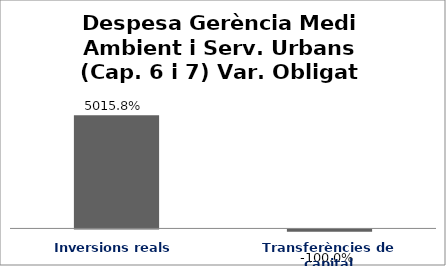
| Category | Series 0 |
|---|---|
| Inversions reals | 50.158 |
| Transferències de capital | -1 |